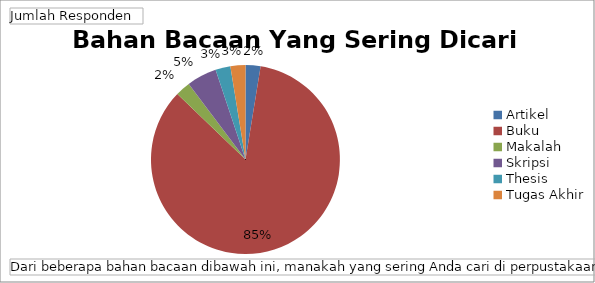
| Category | Total |
|---|---|
| Artikel | 2 |
| Buku | 66 |
| Makalah | 2 |
| Skripsi | 4 |
| Thesis | 2 |
| Tugas Akhir | 2 |